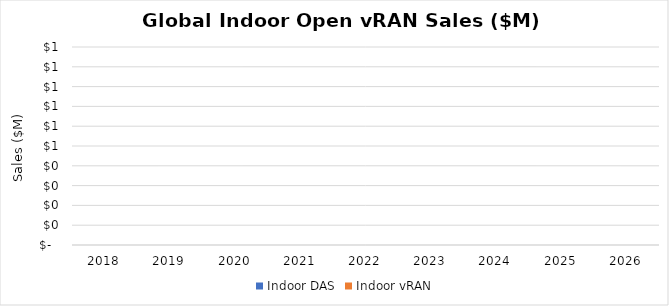
| Category | Indoor DAS | Indoor vRAN |
|---|---|---|
| 2018.0 | 0 | 0 |
| 2019.0 | 0 | 0 |
| 2020.0 | 0 | 0 |
| 2021.0 | 0 | 0 |
| 2022.0 | 0 | 0 |
| 2023.0 | 0 | 0 |
| 2024.0 | 0 | 0 |
| 2025.0 | 0 | 0 |
| 2026.0 | 0 | 0 |